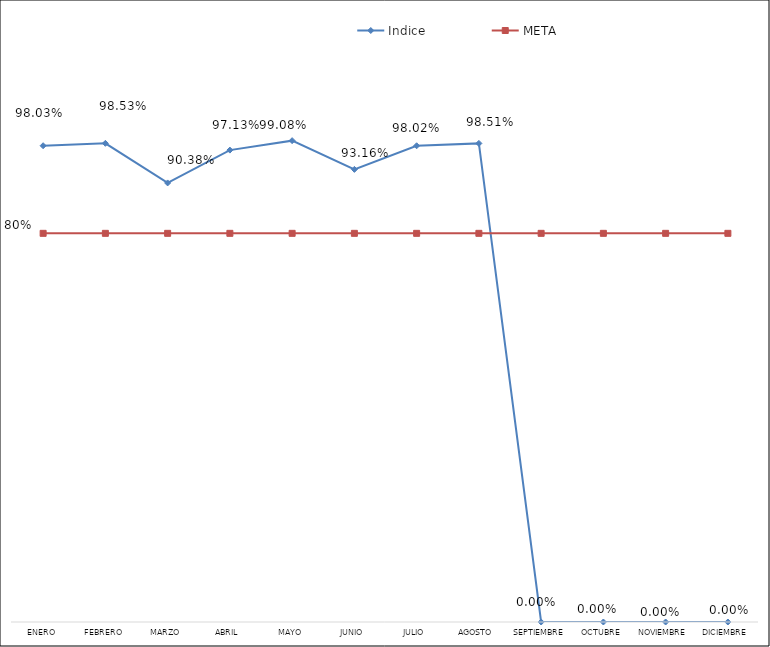
| Category | Indice | META |
|---|---|---|
| Enero | 0.98 | 0.8 |
| Febrero | 0.985 | 0.8 |
| Marzo | 0.904 | 0.8 |
| Abril | 0.971 | 0.8 |
| Mayo | 0.991 | 0.8 |
| Junio | 0.932 | 0.8 |
| Julio | 0.98 | 0.8 |
| Agosto | 0.985 | 0.8 |
| Septiembre | 0 | 0.8 |
| Octubre | 0 | 0.8 |
| Noviembre | 0 | 0.8 |
| Diciembre | 0 | 0.8 |